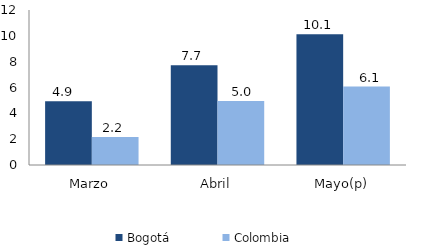
| Category | Bogotá | Colombia |
|---|---|---|
| Marzo | 4.929 | 2.16 |
| Abril | 7.713 | 4.958 |
| Mayo(p) | 10.125 | 6.077 |